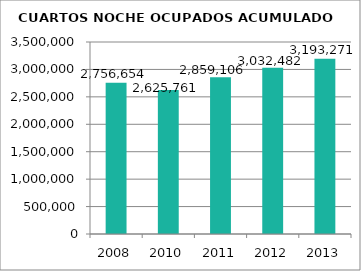
| Category | CUARTOS NOCHE OCUPADOS ACUMULADO |
|---|---|
| 2008.0 | 2756654 |
| 2010.0 | 2625761 |
| 2011.0 | 2859106 |
| 2012.0 | 3032482 |
| 2013.0 | 3193271 |